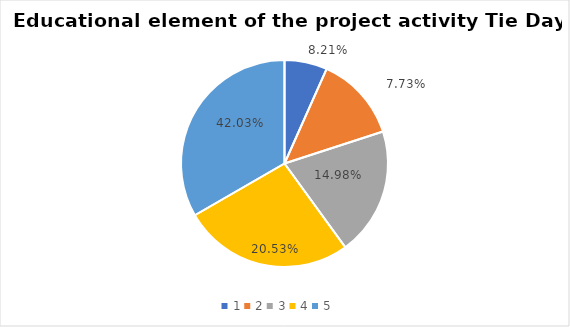
| Category | Series 0 | Series 1 |
|---|---|---|
| 0 | 1 | 0.082 |
| 1 | 2 | 0.077 |
| 2 | 3 | 0.15 |
| 3 | 4 | 0.205 |
| 4 | 5 | 0.42 |